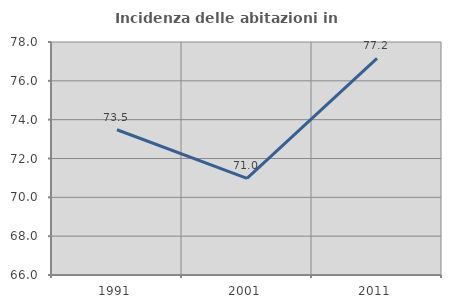
| Category | Incidenza delle abitazioni in proprietà  |
|---|---|
| 1991.0 | 73.482 |
| 2001.0 | 70.974 |
| 2011.0 | 77.157 |